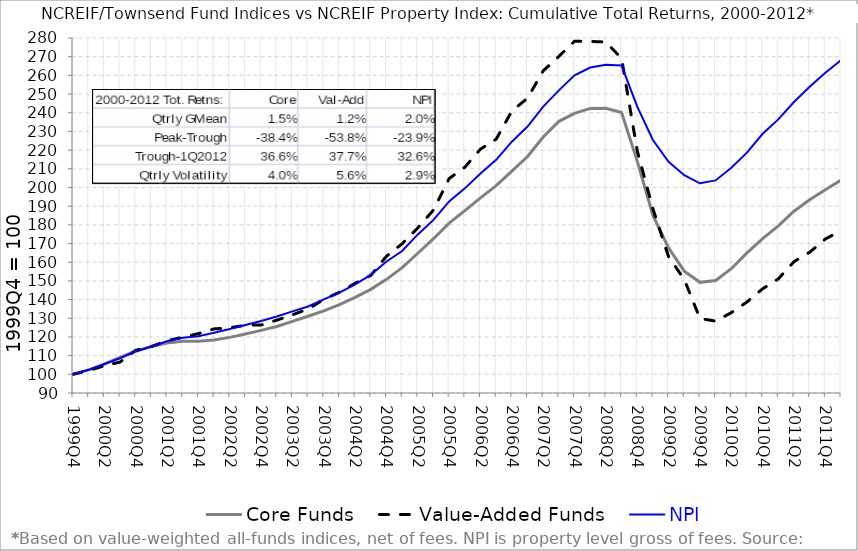
| Category | Core Funds | Value-Added Funds | NPI |
|---|---|---|---|
| 1999Q4 | 100 | 100 | 100 |
| 2000Q1 | 102.36 | 102.016 | 102.4 |
| 2000Q2 | 105.458 | 104.575 | 105.523 |
| 2000Q3 | 109.042 | 106.558 | 108.626 |
| 2000Q4 | 112.507 | 112.83 | 112.243 |
| 2001Q1 | 114.821 | 114.881 | 114.892 |
| 2001Q2 | 116.698 | 117.959 | 117.73 |
| 2001Q3 | 117.664 | 119.85 | 119.613 |
| 2001Q4 | 117.743 | 121.76 | 120.415 |
| 2002Q1 | 118.381 | 124.307 | 122.233 |
| 2002Q2 | 119.762 | 124.874 | 124.201 |
| 2002Q3 | 121.618 | 126.279 | 126.424 |
| 2002Q4 | 123.517 | 126.385 | 128.535 |
| 2003Q1 | 125.586 | 128.971 | 130.952 |
| 2003Q2 | 128.311 | 131.844 | 133.689 |
| 2003Q3 | 131.079 | 134.927 | 136.322 |
| 2003Q4 | 133.959 | 140.098 | 140.085 |
| 2004Q1 | 137.322 | 143.939 | 143.671 |
| 2004Q2 | 141.215 | 148.716 | 148.168 |
| 2004Q3 | 145.474 | 152.917 | 153.235 |
| 2004Q4 | 150.837 | 163.212 | 160.376 |
| 2005Q1 | 157.062 | 169.88 | 166.005 |
| 2005Q2 | 164.806 | 178.375 | 174.87 |
| 2005Q3 | 172.587 | 187.947 | 182.634 |
| 2005Q4 | 180.91 | 204.779 | 192.551 |
| 2006Q1 | 187.614 | 210.864 | 199.522 |
| 2006Q2 | 194.456 | 220.552 | 207.522 |
| 2006Q3 | 200.941 | 225.864 | 214.806 |
| 2006Q4 | 208.764 | 240.911 | 224.494 |
| 2007Q1 | 216.568 | 247.793 | 232.621 |
| 2007Q2 | 227.022 | 262.43 | 243.298 |
| 2007Q3 | 235.394 | 270.171 | 251.96 |
| 2007Q4 | 239.689 | 278.299 | 260.047 |
| 2008Q1 | 242.332 | 278.169 | 264.208 |
| 2008Q2 | 242.437 | 277.835 | 265.688 |
| 2008Q3 | 240.093 | 269.061 | 265.236 |
| 2008Q4 | 214.121 | 219.601 | 243.248 |
| 2009Q1 | 185.007 | 188.622 | 225.418 |
| 2009Q2 | 167.667 | 162.946 | 213.696 |
| 2009Q3 | 155.193 | 150.764 | 206.602 |
| 2009Q4 | 149.234 | 129.881 | 202.242 |
| 2010Q1 | 150.217 | 128.475 | 203.779 |
| 2010Q2 | 156.532 | 132.996 | 210.524 |
| 2010Q3 | 165.018 | 138.712 | 218.651 |
| 2010Q4 | 172.665 | 145.776 | 228.752 |
| 2011Q1 | 179.424 | 151.077 | 236.438 |
| 2011Q2 | 187.271 | 160.307 | 245.754 |
| 2011Q3 | 193.459 | 165.325 | 253.864 |
| 2011Q4 | 198.77 | 172.401 | 261.378 |
| 2012Q1 | 203.895 | 176.891 | 268.148 |